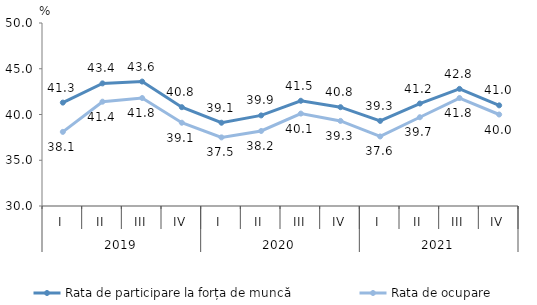
| Category | Rata de participare la forța de muncă | Rata de ocupare |
|---|---|---|
| 0 | 41.3 | 38.1 |
| 1 | 43.4 | 41.4 |
| 2 | 43.6 | 41.8 |
| 3 | 40.8 | 39.1 |
| 4 | 39.1 | 37.5 |
| 5 | 39.9 | 38.2 |
| 6 | 41.5 | 40.1 |
| 7 | 40.8 | 39.3 |
| 8 | 39.3 | 37.6 |
| 9 | 41.2 | 39.7 |
| 10 | 42.8 | 41.8 |
| 11 | 41 | 40 |